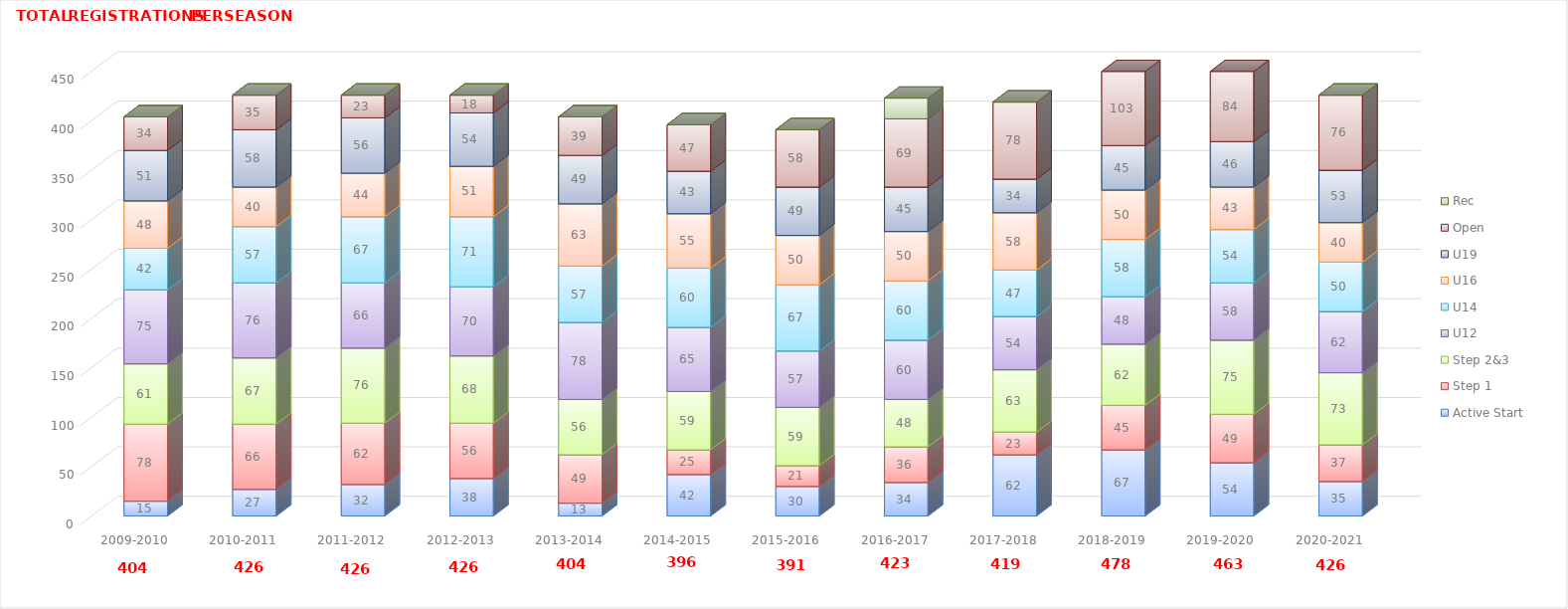
| Category | Active Start | Step 1 | Step 2&3 | U12 | U14 | U16 | U19 | Open | Rec |
|---|---|---|---|---|---|---|---|---|---|
| 2009-2010 | 15 | 78 | 61 | 75 | 42 | 48 | 51 | 34 | 0 |
| 2010-2011 | 27 | 66 | 67 | 76 | 57 | 40 | 58 | 35 | 0 |
| 2011-2012 | 32 | 62 | 76 | 66 | 67 | 44 | 56 | 23 | 0 |
| 2012-2013 | 38 | 56 | 68 | 70 | 71 | 51 | 54 | 18 | 0 |
| 2013-2014 | 13 | 49 | 56 | 78 | 57 | 63 | 49 | 39 | 0 |
| 2014-2015 | 42 | 25 | 59 | 65 | 60 | 55 | 43 | 47 | 0 |
| 2015-2016 | 30 | 21 | 59 | 57 | 67 | 50 | 49 | 58 | 0 |
| 2016-2017 | 34 | 36 | 48 | 60 | 60 | 50 | 45 | 69 | 21 |
| 2017-2018 | 62 | 23 | 63 | 54 | 47 | 58 | 34 | 78 | 0 |
| 2018-2019 | 67 | 45 | 62 | 48 | 58 | 50 | 45 | 103 | 0 |
| 2019-2020 | 54 | 49 | 75 | 58 | 54 | 43 | 46 | 84 | 0 |
| 2020-2021 | 35 | 37 | 73 | 62 | 50 | 40 | 53 | 76 | 0 |